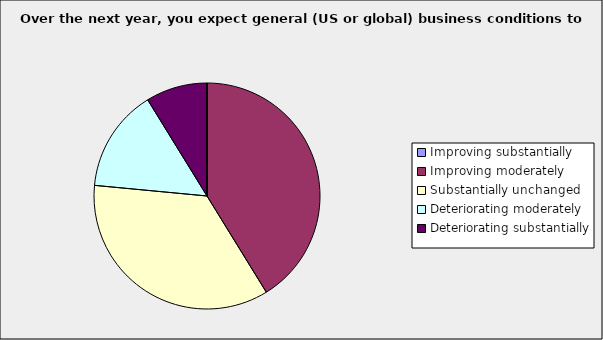
| Category | Series 0 |
|---|---|
| Improving substantially | 0 |
| Improving moderately | 0.412 |
| Substantially unchanged | 0.353 |
| Deteriorating moderately | 0.147 |
| Deteriorating substantially | 0.088 |